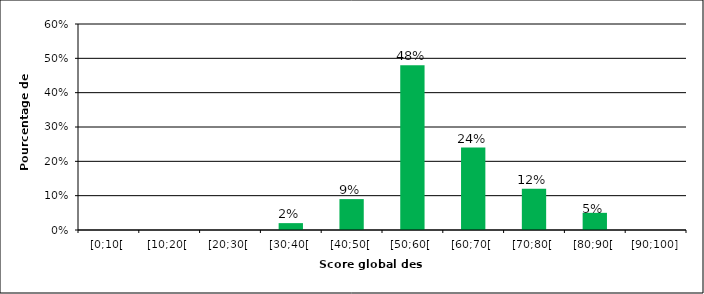
| Category | Series 1 |
|---|---|
| [0;10[ | 0 |
| [10;20[ | 0 |
| [20;30[ | 0 |
| [30;40[ | 0.02 |
| [40;50[ | 0.09 |
| [50;60[ | 0.48 |
| [60;70[ | 0.24 |
| [70;80[ | 0.12 |
| [80;90[ | 0.05 |
| [90;100] | 0 |